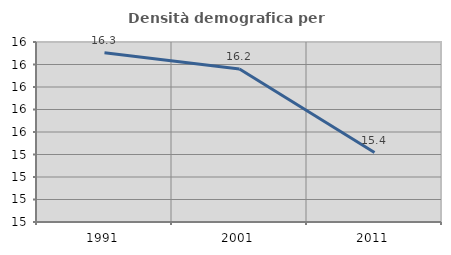
| Category | Densità demografica |
|---|---|
| 1991.0 | 16.304 |
| 2001.0 | 16.159 |
| 2011.0 | 15.417 |